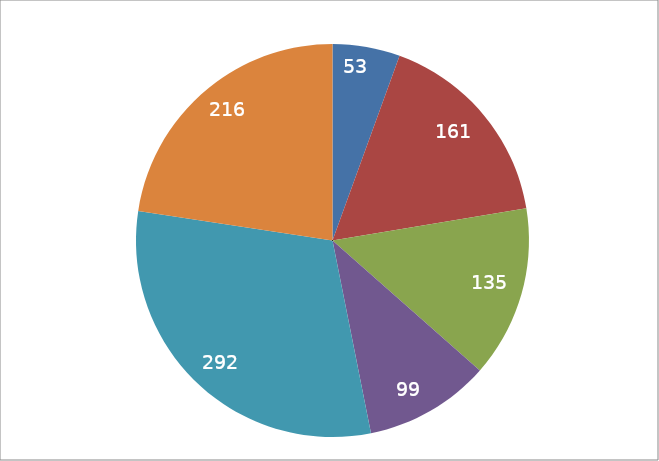
| Category | Series 0 |
|---|---|
| 0 | 53 |
| 1 | 161 |
| 2 | 135 |
| 3 | 99 |
| 4 | 292 |
| 5 | 216 |